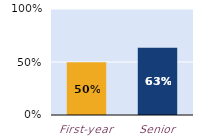
| Category | substantially |
|---|---|
| First-year | 0.497 |
| Senior | 0.634 |